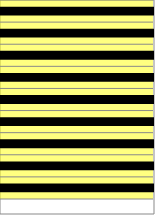
| Category | Series 0 |
|---|---|
| 0 | 1 |
| 1 | 1 |
| 2 | 1 |
| 3 | 1 |
| 4 | 1 |
| 5 | 1 |
| 6 | 1 |
| 7 | 1 |
| 8 | 1 |